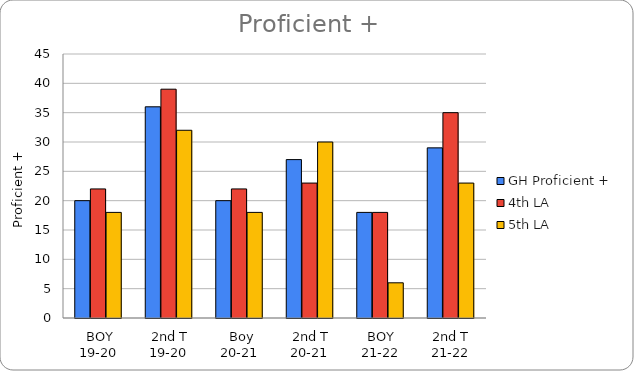
| Category | GH Proficient +  | 4th LA  | 5th LA |
|---|---|---|---|
|  BOY 19-20 | 20 | 22 | 18 |
|  2nd T 19-20 | 36 | 39 | 32 |
|  Boy 20-21 | 20 | 22 | 18 |
|  2nd T 20-21 | 27 | 23 | 30 |
| BOY 21-22 | 18 | 18 | 6 |
| 2nd T 21-22 | 29 | 35 | 23 |